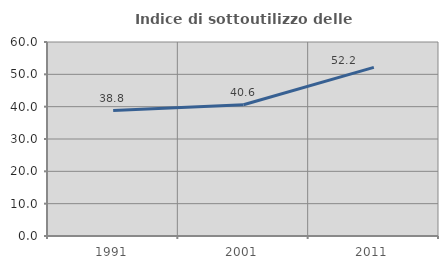
| Category | Indice di sottoutilizzo delle abitazioni  |
|---|---|
| 1991.0 | 38.795 |
| 2001.0 | 40.58 |
| 2011.0 | 52.153 |